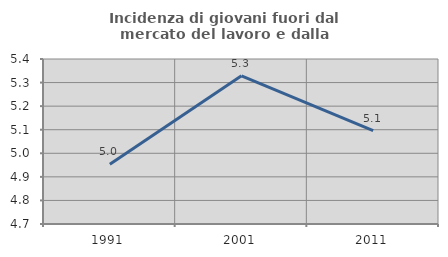
| Category | Incidenza di giovani fuori dal mercato del lavoro e dalla formazione  |
|---|---|
| 1991.0 | 4.954 |
| 2001.0 | 5.328 |
| 2011.0 | 5.096 |